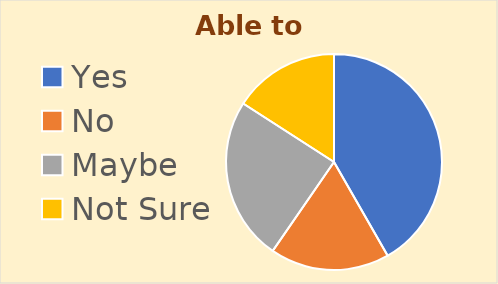
| Category | Series 0 |
|---|---|
| Yes | 63 |
| No | 27 |
| Maybe | 37 |
| Not Sure | 24 |